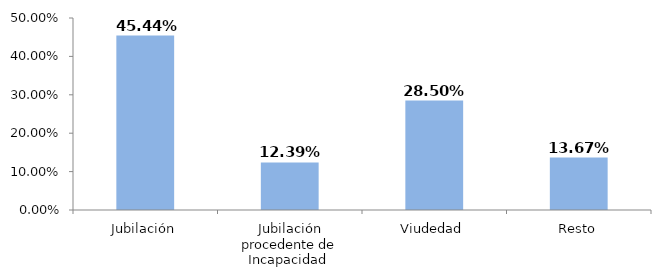
| Category | Series 0 |
|---|---|
| Jubilación | 0.454 |
| Jubilación procedente de Incapacidad  | 0.124 |
| Viudedad | 0.285 |
| Resto | 0.137 |